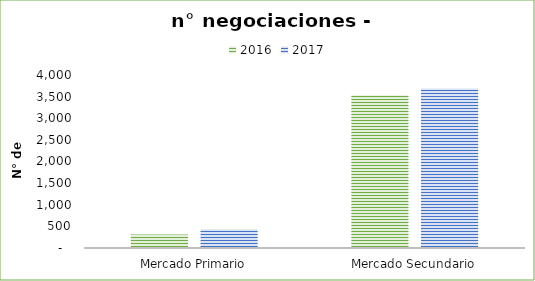
| Category | 2016 | 2017 |
|---|---|---|
| Mercado Primario | 314 | 431 |
| Mercado Secundario | 3533 | 3689 |